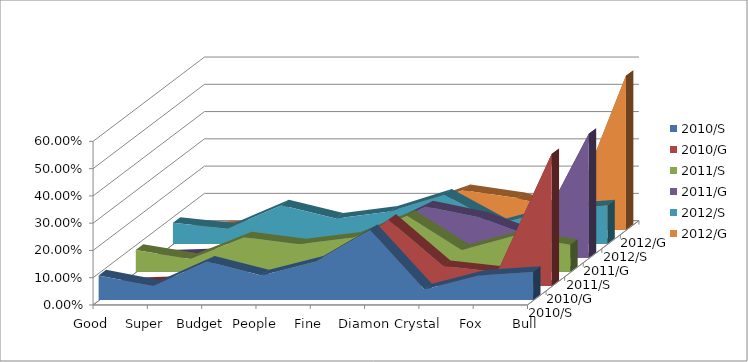
| Category | 2010/S | 2010/G | 2011/S | 2011/G | 2012/S | 2012/G |
|---|---|---|---|---|---|---|
| Good | 0.09 | 0.008 | 0.08 | 0.007 | 0.077 | 0.006 |
| Super | 0.051 | 0.015 | 0.047 | 0.013 | 0.055 | 0.013 |
| Budget | 0.141 | 0.005 | 0.127 | 0.005 | 0.141 | 0.005 |
| People | 0.09 | 0.017 | 0.101 | 0.019 | 0.092 | 0.015 |
| Fine | 0.141 | 0.106 | 0.126 | 0.092 | 0.118 | 0.076 |
| Diamond | 0.256 | 0.242 | 0.205 | 0.188 | 0.18 | 0.145 |
| Crystal | 0.038 | 0.073 | 0.08 | 0.147 | 0.072 | 0.116 |
| Fox | 0.09 | 0.051 | 0.134 | 0.074 | 0.125 | 0.06 |
| Bull | 0.103 | 0.483 | 0.099 | 0.455 | 0.14 | 0.564 |